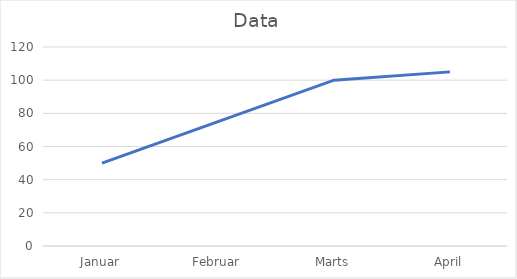
| Category | Data |
|---|---|
| Januar | 50 |
| Februar | 75 |
| Marts | 100 |
| April | 105 |